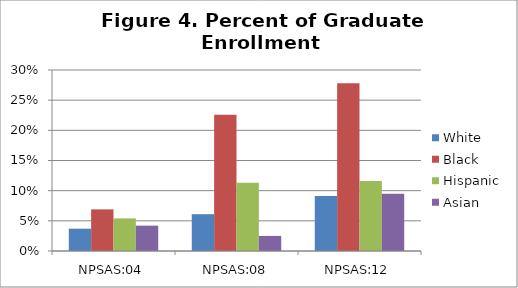
| Category | White | Black | Hispanic | Asian |
|---|---|---|---|---|
| NPSAS:04 | 0.037 | 0.069 | 0.054 | 0.042 |
| NPSAS:08 | 0.061 | 0.226 | 0.113 | 0.025 |
| NPSAS:12 | 0.091 | 0.278 | 0.116 | 0.095 |